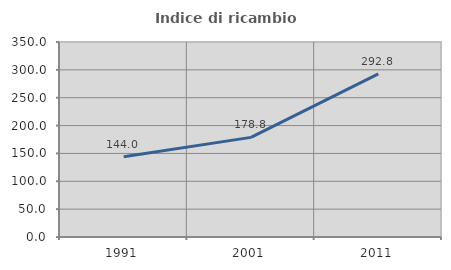
| Category | Indice di ricambio occupazionale  |
|---|---|
| 1991.0 | 144.01 |
| 2001.0 | 178.806 |
| 2011.0 | 292.832 |